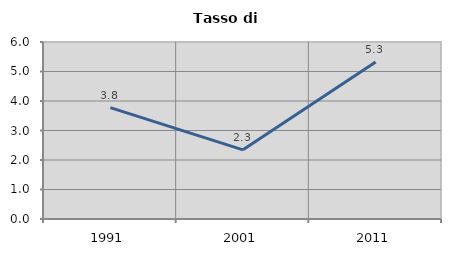
| Category | Tasso di disoccupazione   |
|---|---|
| 1991.0 | 3.778 |
| 2001.0 | 2.345 |
| 2011.0 | 5.318 |